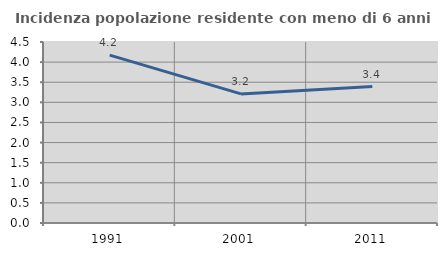
| Category | Incidenza popolazione residente con meno di 6 anni |
|---|---|
| 1991.0 | 4.173 |
| 2001.0 | 3.21 |
| 2011.0 | 3.391 |